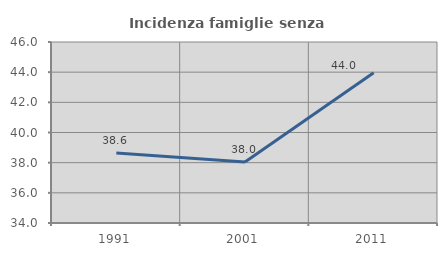
| Category | Incidenza famiglie senza nuclei |
|---|---|
| 1991.0 | 38.636 |
| 2001.0 | 38.043 |
| 2011.0 | 43.956 |